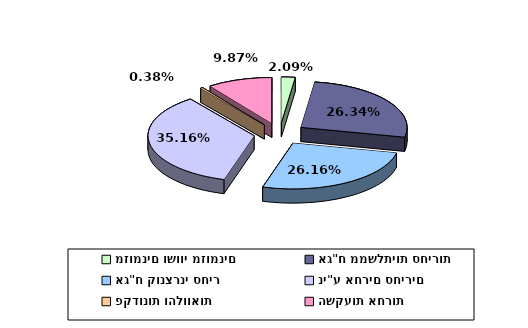
| Category | Series 0 |
|---|---|
| מזומנים ושווי מזומנים | 0.021 |
| אג"ח ממשלתיות סחירות | 0.263 |
| אג"ח קונצרני סחיר | 0.262 |
| ני"ע אחרים סחירים | 0.352 |
| פקדונות והלוואות | 0.004 |
| השקעות אחרות | 0.099 |